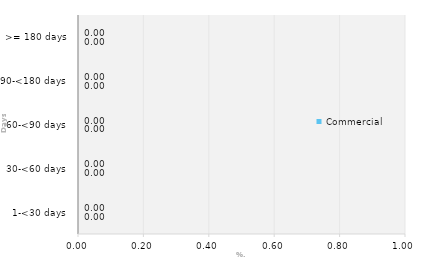
| Category | Commercial | Public |
|---|---|---|
| 1-<30 days | 0 | 0 |
| 30-<60 days | 0 | 0 |
| 60-<90 days | 0 | 0 |
| 90-<180 days | 0 | 0 |
| >= 180 days | 0 | 0 |